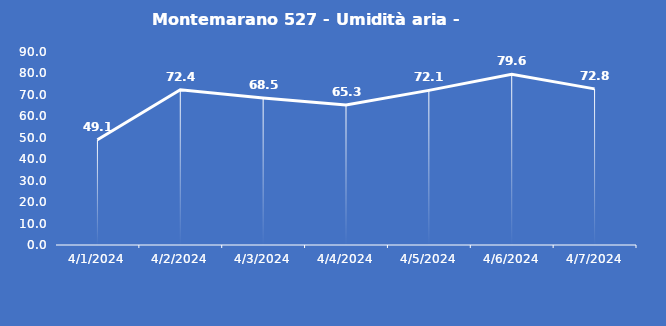
| Category | Montemarano 527 - Umidità aria - Grezzo (%) |
|---|---|
| 4/1/24 | 49.1 |
| 4/2/24 | 72.4 |
| 4/3/24 | 68.5 |
| 4/4/24 | 65.3 |
| 4/5/24 | 72.1 |
| 4/6/24 | 79.6 |
| 4/7/24 | 72.8 |